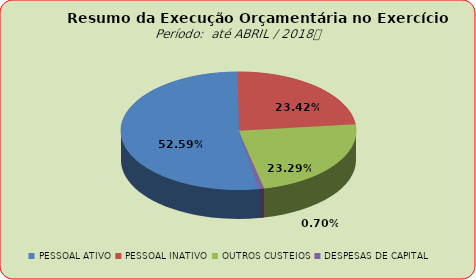
| Category | Series 0 |
|---|---|
| PESSOAL ATIVO | 50010306.1 |
| PESSOAL INATIVO | 22272878.75 |
| OUTROS CUSTEIOS | 22150335.94 |
| DESPESAS DE CAPITAL | 662494.93 |